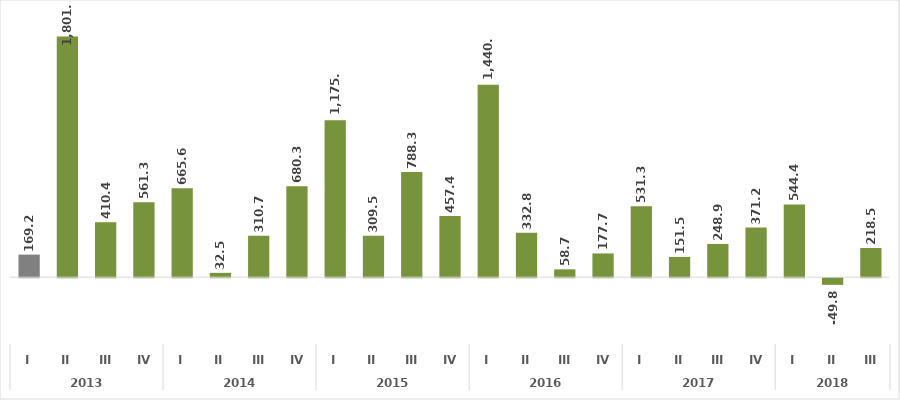
| Category | Series 0 |
|---|---|
| 0 | 169.155 |
| 1 | 1801.932 |
| 2 | 410.401 |
| 3 | 561.275 |
| 4 | 665.62 |
| 5 | 32.537 |
| 6 | 310.674 |
| 7 | 680.292 |
| 8 | 1175.187 |
| 9 | 309.476 |
| 10 | 788.261 |
| 11 | 457.411 |
| 12 | 1440.786 |
| 13 | 332.766 |
| 14 | 58.729 |
| 15 | 177.744 |
| 16 | 531.345 |
| 17 | 151.534 |
| 18 | 248.877 |
| 19 | 371.227 |
| 20 | 544.392 |
| 21 | -49.794 |
| 22 | 218.499 |